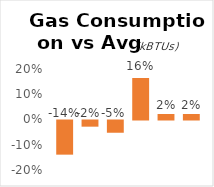
| Category | Series 0 |
|---|---|
| 0 | -0.135 |
| 1 | -0.024 |
| 2 | -0.049 |
| 3 | 0.164 |
| 4 | 0.022 |
| 5 | 0.022 |